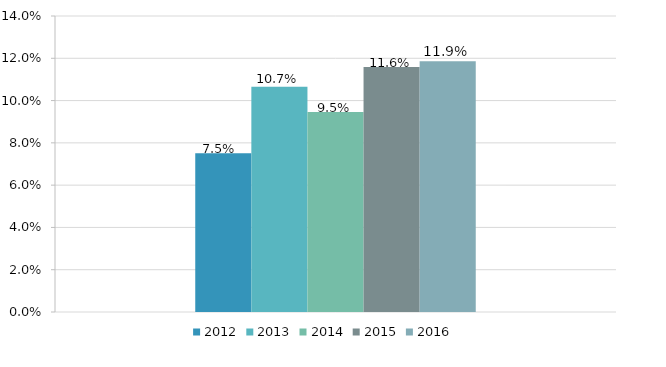
| Category | 2012 | 2013 | 2014 | 2015 | 2016 |
|---|---|---|---|---|---|
| Série | 0.075 | 0.107 | 0.095 | 0.116 | 0.119 |